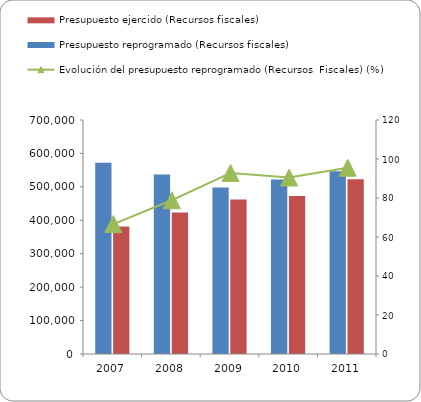
| Category | Presupuesto reprogramado (Recursos fiscales) | Presupuesto ejercido (Recursos fiscales)  |
|---|---|---|
| 2007 | 571818 | 381040 |
| 2008 | 537197 | 423488 |
| 2009 | 497917 | 462415 |
| 2010 | 522271 | 472713 |
| 2011 | 546914 | 522410 |